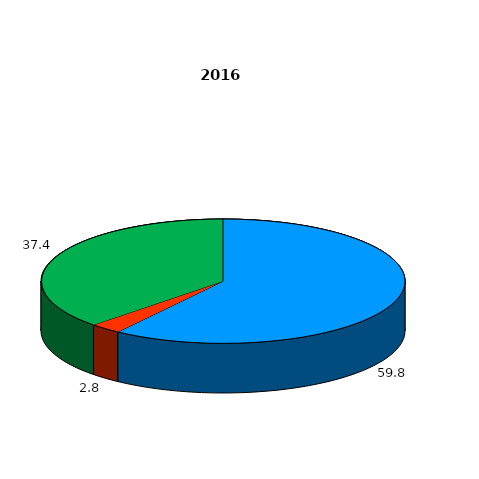
| Category | Series 0 |
|---|---|
| Сельскохозяйственные организации  | 59.8 |
| Крестьянские (фермерские) хозяйства и индивидуальные предприниматели  | 2.8 |
| Личные подсобные и другие индивидуальные хозяйства граждан  | 37.4 |